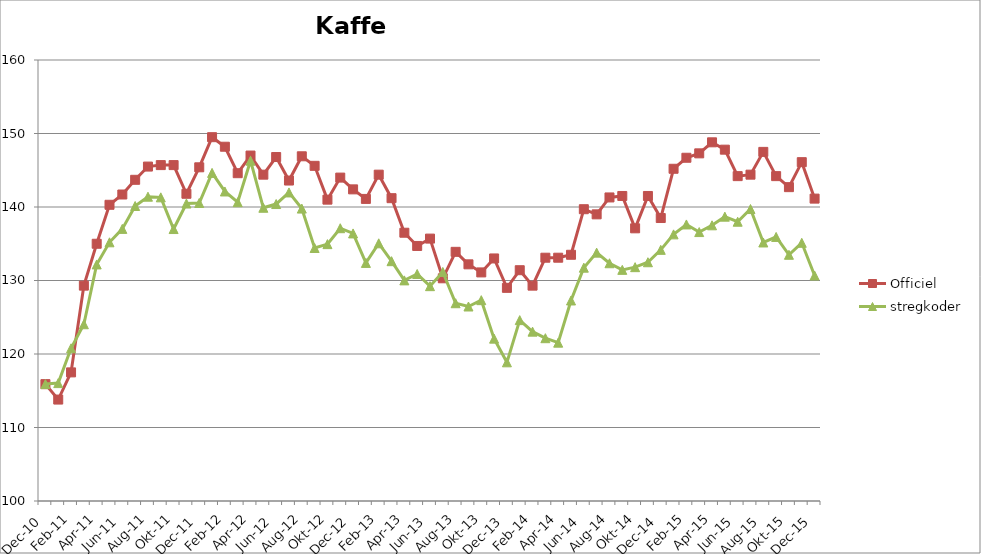
| Category | Officiel | stregkoder |
|---|---|---|
|  Dec-10 | 115.9 | 115.907 |
|  Jan-11 | 113.8 | 116.042 |
|  Feb-11 | 117.5 | 120.774 |
|  Mar-11 | 129.3 | 124.048 |
|  Apr-11 | 135 | 132.184 |
|  Maj-11 | 140.3 | 135.196 |
|  Jun-11 | 141.7 | 137.022 |
|  Jul-11 | 143.7 | 140.136 |
|  Aug-11 | 145.5 | 141.402 |
|  Sep-11 | 145.7 | 141.316 |
|  Okt-11 | 145.7 | 137.001 |
|  Nov-11 | 141.8 | 140.471 |
|  Dec-11 | 145.4 | 140.548 |
|  Jan-12 | 149.5 | 144.642 |
|  Feb-12 | 148.2 | 142.113 |
|  Mar-12 | 144.6 | 140.653 |
|  Apr-12 | 147 | 146.298 |
|  Maj-12 | 144.4 | 139.895 |
|  Jun-12 | 146.8 | 140.403 |
|  Jul-12 | 143.6 | 141.981 |
|  Aug-12 | 146.9 | 139.784 |
|  Sep-12 | 145.6 | 134.42 |
|  Okt-12 | 141 | 134.947 |
|  Nov-12 | 144 | 137.115 |
|  Dec-12 | 142.4 | 136.403 |
|  Jan-13 | 141.1 | 132.392 |
|  Feb-13 | 144.4 | 135.06 |
|  Mar-13 | 141.2 | 132.628 |
|  Apr-13 | 136.5 | 130.015 |
|  Maj-13 | 134.7 | 130.885 |
|  Jun-13 | 135.7 | 129.229 |
|  Jul-13 | 130.3 | 131.165 |
|  Aug-13 | 133.9 | 126.908 |
|  Sep-13 | 132.2 | 126.462 |
|  Okt-13 | 131.1 | 127.324 |
|  Nov-13 | 133 | 122.09 |
|  Dec-13 | 129 | 118.868 |
|  Jan-14 | 131.4 | 124.609 |
|  Feb-14 | 129.3 | 123.04 |
|  Mar-14 | 133.1 | 122.15 |
|  Apr-14 | 133.1 | 121.542 |
|  Maj-14 | 133.5 | 127.281 |
|  Jun-14 | 139.7 | 131.744 |
|  Jul-14 | 139 | 133.793 |
|  Aug-14 | 141.3 | 132.348 |
|  Sep-14 | 141.5 | 131.447 |
|  Okt-14 | 137.1 | 131.815 |
|  Nov-14 | 141.5 | 132.484 |
|  Dec-14 | 138.5 | 134.17 |
|  Jan-15 | 145.2 | 136.277 |
|  Feb-15 | 146.7 | 137.626 |
|  Mar-15 | 147.3 | 136.588 |
|  Apr-15 | 148.8 | 137.51 |
|  Maj-15 | 147.8 | 138.685 |
| Jun-15 | 144.2 | 137.996 |
| Jul-15 | 144.4 | 139.722 |
| Aug-15 | 147.5 | 135.172 |
| Sep-15 | 144.2 | 135.928 |
| Okt-15 | 142.7 | 133.498 |
| Nov-15 | 146.1 | 135.129 |
| Dec-15 | 141.141 | 130.68 |